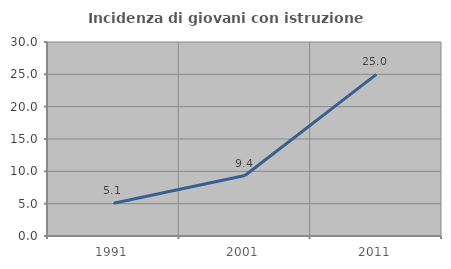
| Category | Incidenza di giovani con istruzione universitaria |
|---|---|
| 1991.0 | 5.072 |
| 2001.0 | 9.355 |
| 2011.0 | 25 |